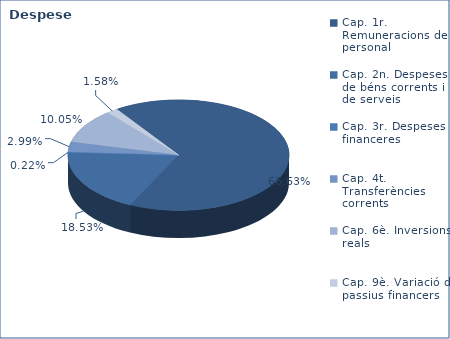
| Category | Series 0 |
|---|---|
| Cap. 1r. Remuneracions de personal | 196320343 |
| Cap. 2n. Despeses de béns corrents i de serveis | 54591140 |
| Cap. 3r. Despeses financeres | 647669 |
| Cap. 4t. Transferències corrents | 8805031 |
| Cap. 6è. Inversions reals | 29607651 |
| Cap. 9è. Variació de passius financers | 4665112 |